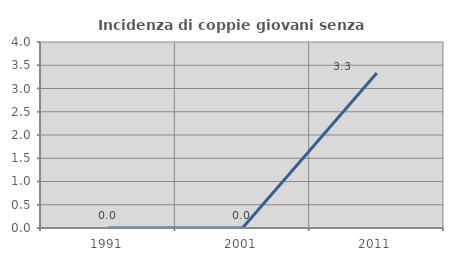
| Category | Incidenza di coppie giovani senza figli |
|---|---|
| 1991.0 | 0 |
| 2001.0 | 0 |
| 2011.0 | 3.333 |